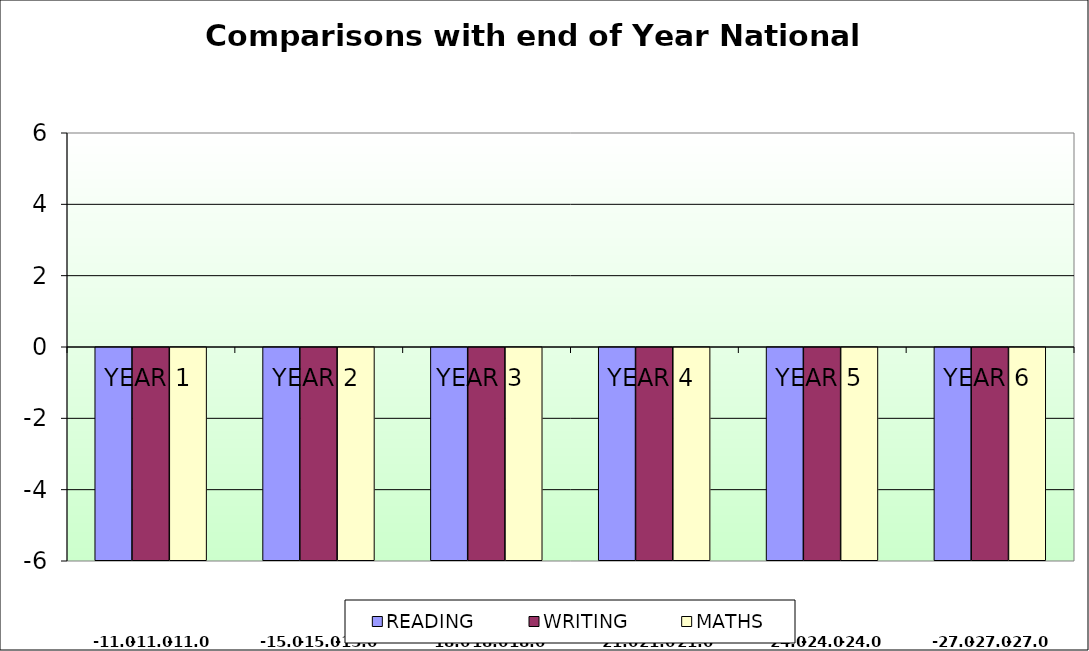
| Category | READING | WRITING | MATHS |
|---|---|---|---|
| YEAR 1 | -11 | -11 | -11 |
| YEAR 2 | -15 | -15 | -15 |
| YEAR 3  | -18 | -18 | -18 |
| YEAR 4 | -21 | -21 | -21 |
| YEAR 5 | -24 | -24 | -24 |
| YEAR 6 | -27 | -27 | -27 |